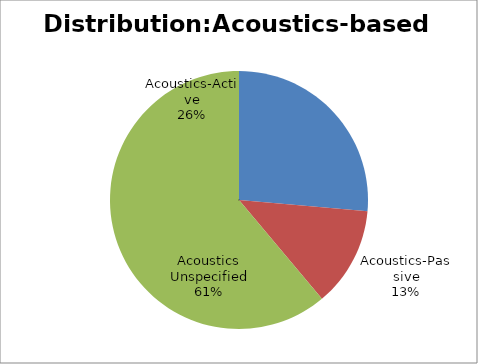
| Category | Distribution:Acoustics-based sensors |
|---|---|
| Acoustics-Active | 19 |
| Acoustics-Passive | 9 |
| Acoustics Unspecified | 44 |